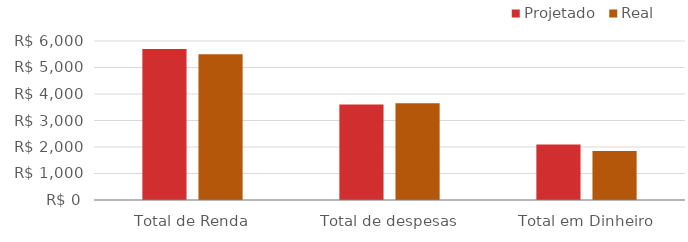
| Category | Projetado | Real |
|---|---|---|
| Total de Renda | 5700 | 5500 |
| Total de despesas | 3603 | 3655 |
| Total em Dinheiro | 2097 | 1845 |